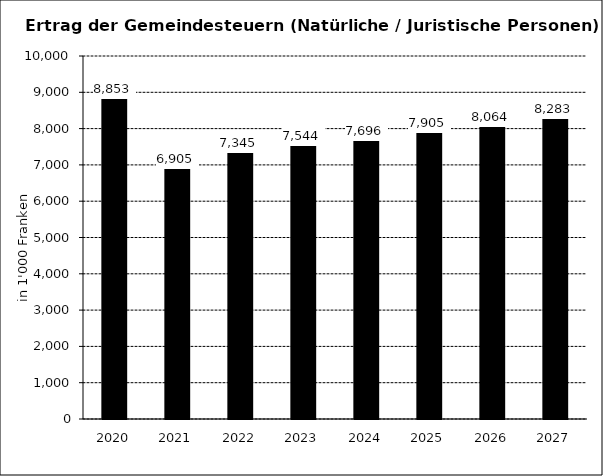
| Category | Ertrag der Gemeindesteuern (Nat/Jur Personen) |
|---|---|
| 2020.0 | 8853 |
| 2021.0 | 6905 |
| 2022.0 | 7345 |
| 2023.0 | 7544.195 |
| 2024.0 | 7695.72 |
| 2025.0 | 7904.824 |
| 2026.0 | 8063.594 |
| 2027.0 | 8283.104 |